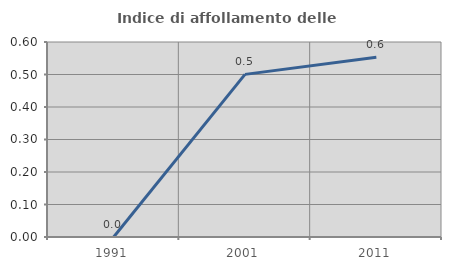
| Category | Indice di affollamento delle abitazioni  |
|---|---|
| 1991.0 | 0 |
| 2001.0 | 0.5 |
| 2011.0 | 0.553 |